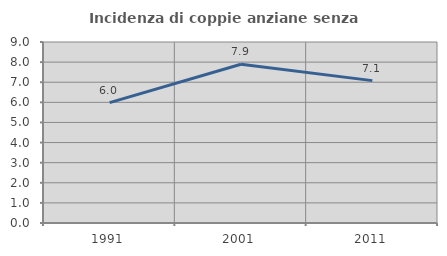
| Category | Incidenza di coppie anziane senza figli  |
|---|---|
| 1991.0 | 5.983 |
| 2001.0 | 7.895 |
| 2011.0 | 7.08 |